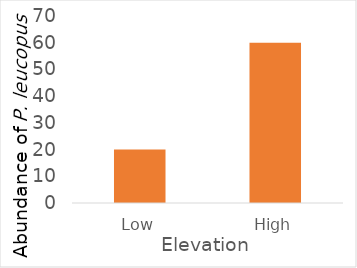
| Category | Series 0 |
|---|---|
| Low | 20 |
| High | 60 |